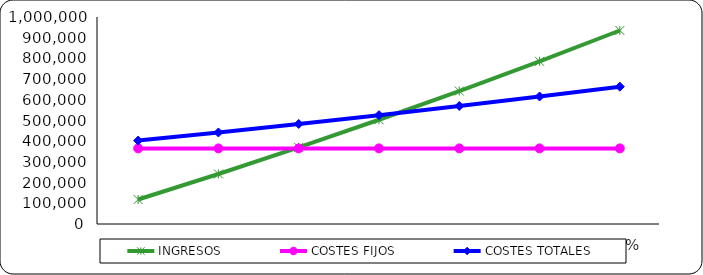
| Category | INGRESOS | COSTES FIJOS | COSTES TOTALES |
|---|---|---|---|
| 0.2 | 118268.395 | 365280.4 | 402986.886 |
| 0.4 | 241628.58 | 365280.4 | 442322.746 |
| 0.6 | 370080.555 | 365280.4 | 483287.978 |
| 0.8 | 503624.32 | 365280.4 | 525882.582 |
| 1.0 | 642259.875 | 365280.4 | 570106.56 |
| 1.2 | 785987.22 | 365280.4 | 615959.91 |
| 1.4 | 934806.355 | 365280.4 | 663442.634 |